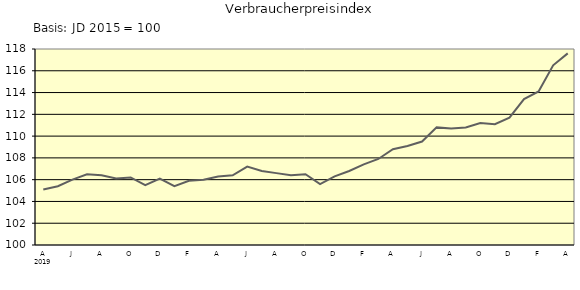
| Category | Series 0 |
|---|---|
| 0 | 105.1 |
| 1 | 105.4 |
| 2 | 106 |
| 3 | 106.5 |
| 4 | 106.4 |
| 5 | 106.1 |
| 6 | 106.2 |
| 7 | 105.5 |
| 8 | 106.1 |
| 9 | 105.4 |
| 10 | 105.9 |
| 11 | 106 |
| 12 | 106.3 |
| 13 | 106.4 |
| 14 | 107.2 |
| 15 | 106.8 |
| 16 | 106.6 |
| 17 | 106.4 |
| 18 | 106.5 |
| 19 | 105.6 |
| 20 | 106.3 |
| 21 | 106.8 |
| 22 | 107.4 |
| 23 | 107.9 |
| 24 | 108.8 |
| 25 | 109.1 |
| 26 | 109.5 |
| 27 | 110.8 |
| 28 | 110.7 |
| 29 | 110.8 |
| 30 | 111.2 |
| 31 | 111.1 |
| 32 | 111.7 |
| 33 | 113.4 |
| 34 | 114.1 |
| 35 | 116.5 |
| 36 | 117.6 |